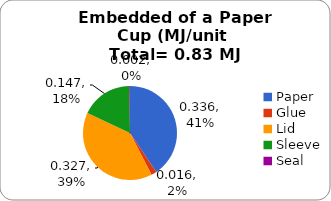
| Category | Series 0 |
|---|---|
| Paper | 0.336 |
| Glue | 0.016 |
| Lid | 0.327 |
| Sleeve | 0.147 |
| Seal | 0.002 |